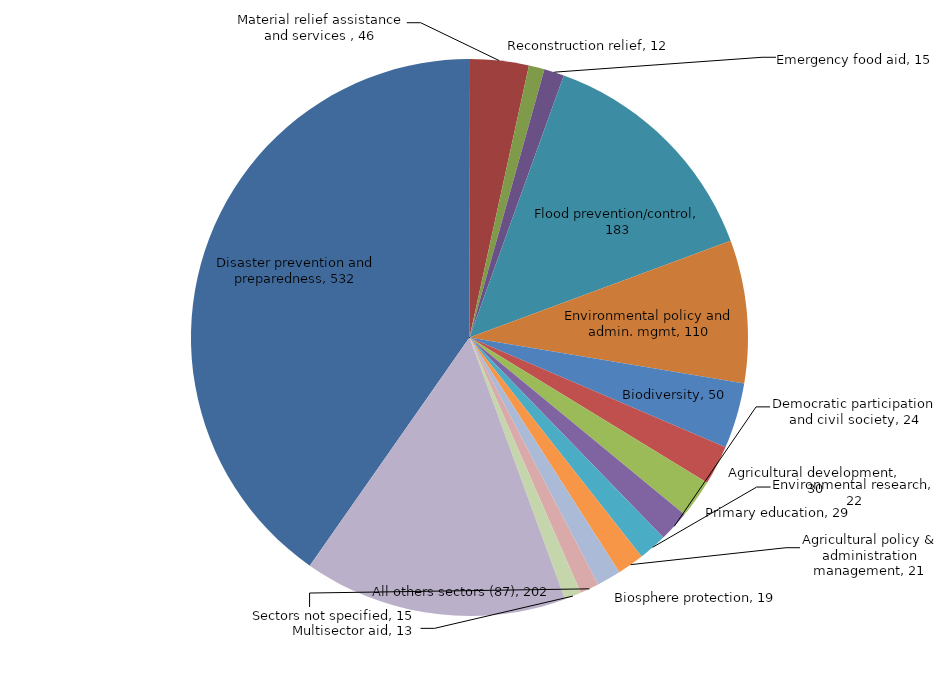
| Category | US$ millions |
|---|---|
| Disaster prevention and preparedness | 532.034 |
| Material relief assistance and services  | 45.604 |
| Reconstruction relief | 12.03 |
| Emergency food aid | 15.392 |
| Flood prevention/control | 183.075 |
| Environmental policy and admin. mgmt | 109.514 |
| Biodiversity | 50.378 |
| Agricultural development | 30.229 |
| Primary education | 29.48 |
| Democratic participation and civil society | 23.629 |
| Environmental research | 21.793 |
| Agricultural policy & administration management | 20.599 |
| Biosphere protection | 18.519 |
| Sectors not specified | 14.561 |
| Multisector aid | 12.846 |
| All others sectors (87) | 202.085 |